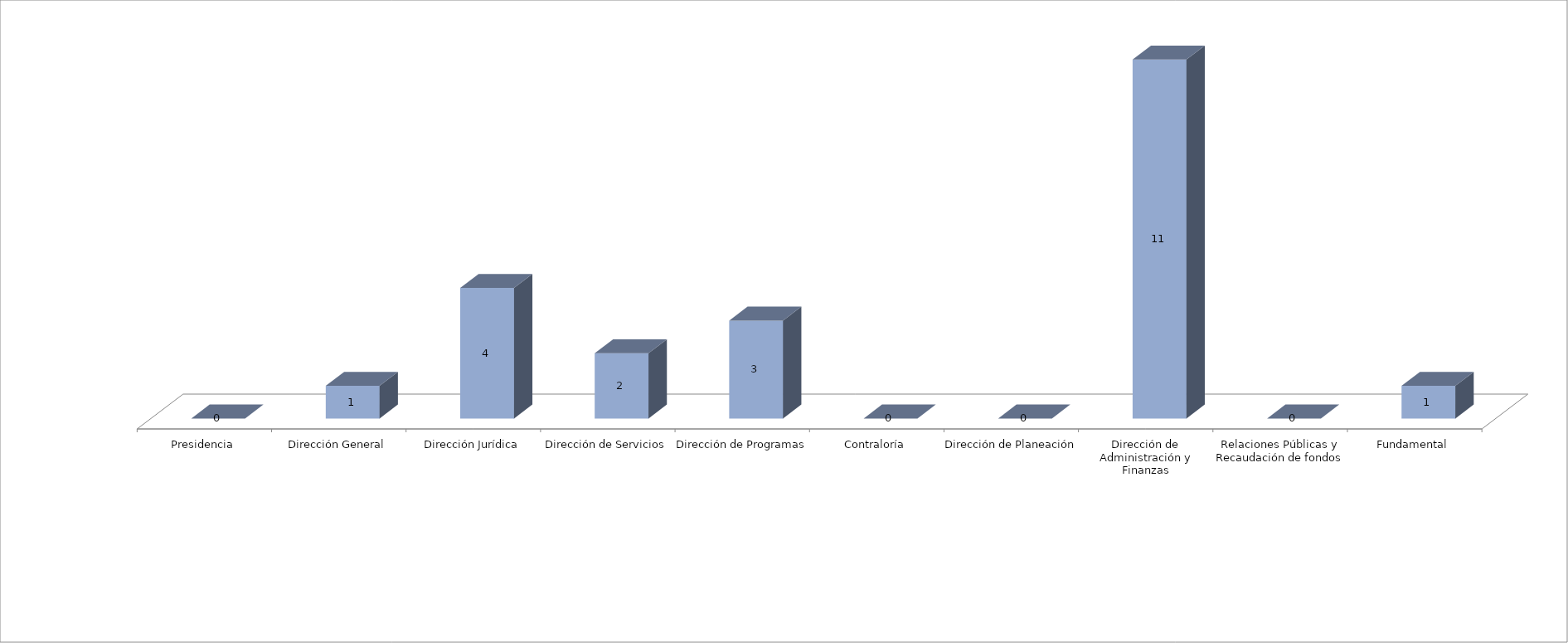
| Category | Series 0 | Series 1 |
|---|---|---|
| Presidencia |  | 0 |
| Dirección General |  | 1 |
| Dirección Jurídica |  | 4 |
| Dirección de Servicios |  | 2 |
| Dirección de Programas |  | 3 |
| Contraloría |  | 0 |
| Dirección de Planeación |  | 0 |
| Dirección de Administración y Finanzas |  | 11 |
| Relaciones Públicas y Recaudación de fondos |  | 0 |
| Fundamental |  | 1 |